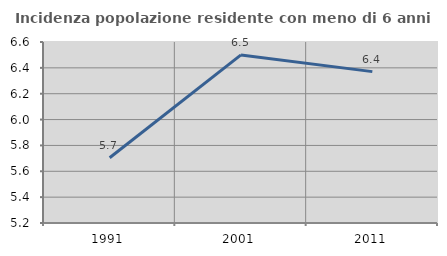
| Category | Incidenza popolazione residente con meno di 6 anni |
|---|---|
| 1991.0 | 5.704 |
| 2001.0 | 6.5 |
| 2011.0 | 6.371 |